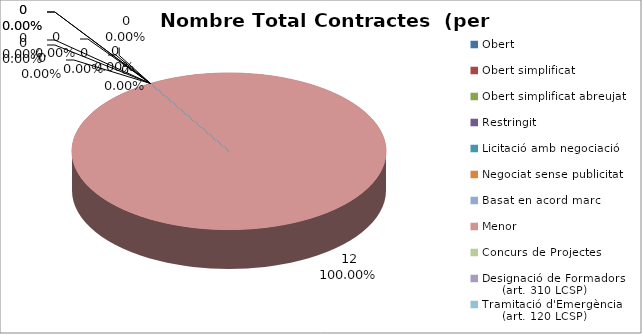
| Category | Nombre Total Contractes |
|---|---|
| Obert | 0 |
| Obert simplificat | 0 |
| Obert simplificat abreujat | 0 |
| Restringit | 0 |
| Licitació amb negociació | 0 |
| Negociat sense publicitat | 0 |
| Basat en acord marc | 0 |
| Menor | 12 |
| Concurs de Projectes | 0 |
| Designació de Formadors
     (art. 310 LCSP) | 0 |
| Tramitació d'Emergència
     (art. 120 LCSP) | 0 |